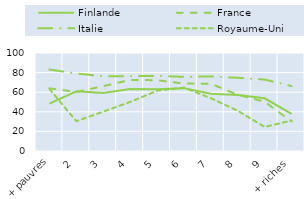
| Category | Finlande | France | Italie | Royaume-Uni |
|---|---|---|---|---|
|  + pauvres | 48.27 | 63.92 | 83.14 | 63.36 |
| 2 | 60.96 | 60.25 | 79.02 | 30.43 |
| 3 | 59.29 | 66.12 | 76.3 | 40.15 |
| 4 | 63.33 | 72.6 | 76.34 | 50.04 |
| 5 | 62.91 | 72.2 | 76.63 | 61.46 |
| 6 | 64.15 | 68.81 | 75.68 | 64.62 |
| 7 | 58.5 | 68.65 | 76.07 | 53.87 |
| 8 | 57.1 | 57.34 | 74.69 | 41.04 |
| 9 | 53.79 | 50.3 | 72.89 | 24.55 |
|  + riches | 37.91 | 30.14 | 66.28 | 31.05 |